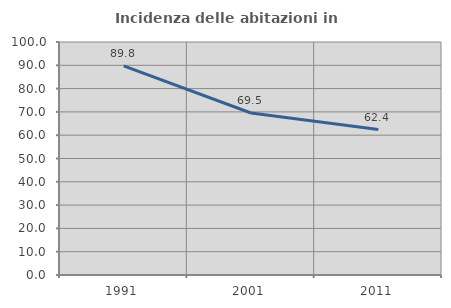
| Category | Incidenza delle abitazioni in proprietà  |
|---|---|
| 1991.0 | 89.77 |
| 2001.0 | 69.515 |
| 2011.0 | 62.434 |